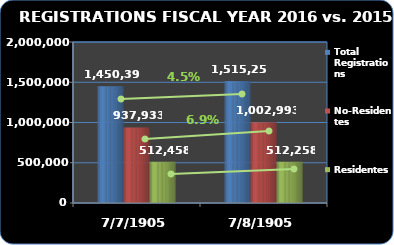
| Category | Total Registrations | No-Residentes | Residentes |
|---|---|---|---|
| 2016.0 | 1515251 | 1002993 | 512258 |
| 2015.0 | 1450391 | 937933 | 512458 |